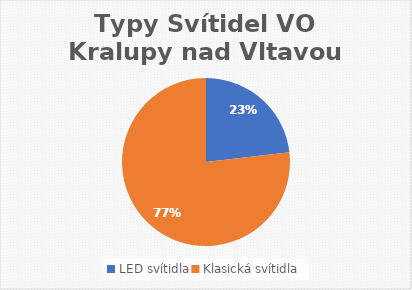
| Category | Typy Svítidel VO Kralupy nad Vltavou |
|---|---|
| LED svítidla | 538 |
| Klasická svítidla | 1786 |